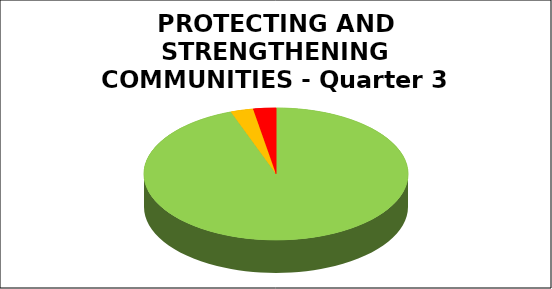
| Category | Series 0 |
|---|---|
| Green | 0.944 |
| Amber | 0.028 |
| Red | 0.028 |